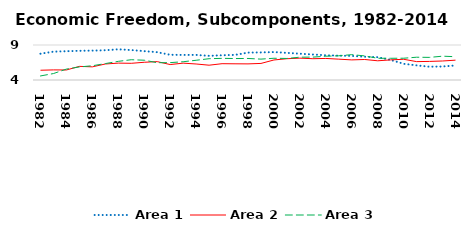
| Category | Area 1 | Area 2 | Area 3 |
|---|---|---|---|
| 1982.0 | 7.754 | 5.394 | 4.579 |
| 1983.0 | 8.048 | 5.444 | 4.921 |
| 1984.0 | 8.114 | 5.432 | 5.558 |
| 1985.0 | 8.169 | 5.948 | 5.865 |
| 1986.0 | 8.202 | 5.878 | 6.036 |
| 1987.0 | 8.248 | 6.286 | 6.345 |
| 1988.0 | 8.387 | 6.413 | 6.664 |
| 1989.0 | 8.281 | 6.386 | 6.895 |
| 1990.0 | 8.124 | 6.533 | 6.827 |
| 1991.0 | 7.974 | 6.623 | 6.471 |
| 1992.0 | 7.604 | 6.207 | 6.481 |
| 1993.0 | 7.579 | 6.408 | 6.609 |
| 1994.0 | 7.588 | 6.288 | 6.818 |
| 1995.0 | 7.449 | 6.116 | 7.042 |
| 1996.0 | 7.536 | 6.33 | 7.091 |
| 1997.0 | 7.587 | 6.315 | 7.066 |
| 1998.0 | 7.914 | 6.302 | 7.076 |
| 1999.0 | 7.94 | 6.367 | 6.984 |
| 2000.0 | 7.989 | 6.86 | 7.107 |
| 2001.0 | 7.874 | 7.041 | 7.076 |
| 2002.0 | 7.759 | 7.121 | 7.259 |
| 2003.0 | 7.646 | 7.041 | 7.27 |
| 2004.0 | 7.534 | 7.08 | 7.4 |
| 2005.0 | 7.476 | 6.977 | 7.459 |
| 2006.0 | 7.439 | 6.872 | 7.622 |
| 2007.0 | 7.322 | 6.93 | 7.442 |
| 2008.0 | 7.262 | 6.745 | 7.104 |
| 2009.0 | 6.862 | 6.874 | 7.103 |
| 2010.0 | 6.317 | 6.96 | 7.113 |
| 2011.0 | 6.091 | 6.626 | 7.253 |
| 2012.0 | 5.899 | 6.656 | 7.231 |
| 2013.0 | 5.931 | 6.715 | 7.402 |
| 2014.0 | 6.075 | 6.833 | 7.328 |